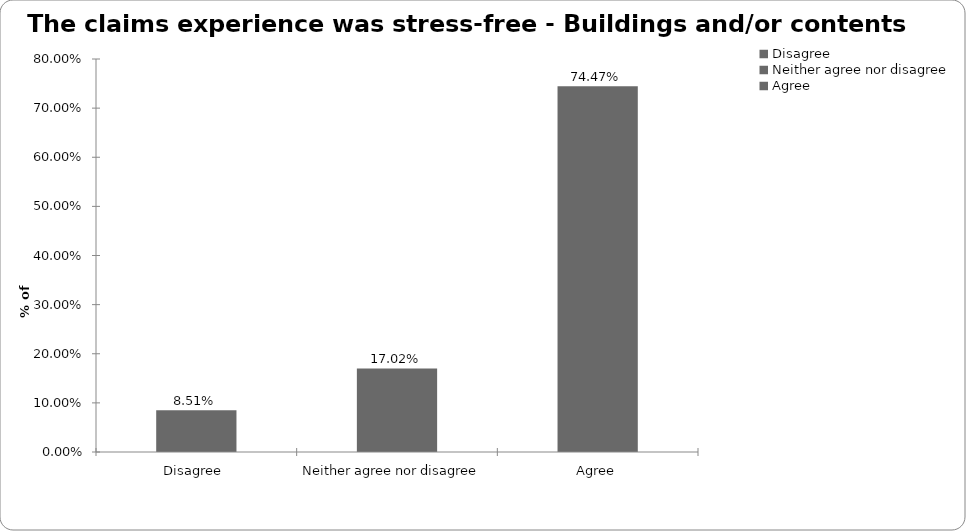
| Category | Buildings and/or conents |
|---|---|
| Disagree  | 0.085 |
| Neither agree nor disagree  | 0.17 |
| Agree | 0.745 |